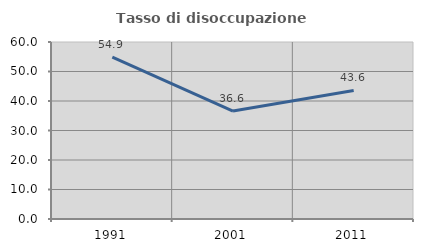
| Category | Tasso di disoccupazione giovanile  |
|---|---|
| 1991.0 | 54.878 |
| 2001.0 | 36.585 |
| 2011.0 | 43.59 |